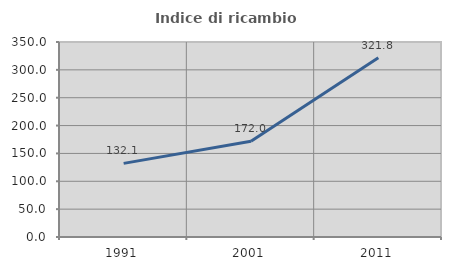
| Category | Indice di ricambio occupazionale  |
|---|---|
| 1991.0 | 132.121 |
| 2001.0 | 171.975 |
| 2011.0 | 321.818 |